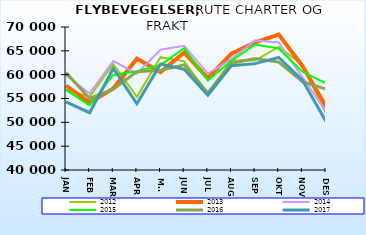
| Category | 2012 | 2013 | 2014 | 2015 | 2016 | 2017 |
|---|---|---|---|---|---|---|
| JAN | 56819 | 57714 | 59820 | 56825 | 60449 | 54284 |
| FEB | 55392 | 54126 | 56061 | 53551 | 54999 | 52025 |
| MAR | 62199 | 57109 | 62844 | 59940 | 56951 | 61307 |
| APR | 55343 | 63351 | 60249 | 60712 | 60633 | 53889 |
| MAI | 63707 | 60558 | 65236 | 62021 | 60932 | 62225 |
| JUN | 62806 | 64643 | 66038 | 65567 | 62070 | 61125 |
| JUL | 56042 | 59264 | 60236 | 58785 | 56170 | 55689 |
| AUG | 62970 | 64412 | 63263 | 62924 | 62414 | 61888 |
| SEP | 62970 | 66778 | 67191 | 66307 | 63364 | 62314 |
| OKT | 65814 | 68393 | 66736 | 65502 | 62632 | 63606 |
| NOV | 62097 | 61858 | 59497 | 60634 | 58513 | 58855 |
| DES | 51784 | 53323 | 52266 | 58152 | 56969 | 50189 |